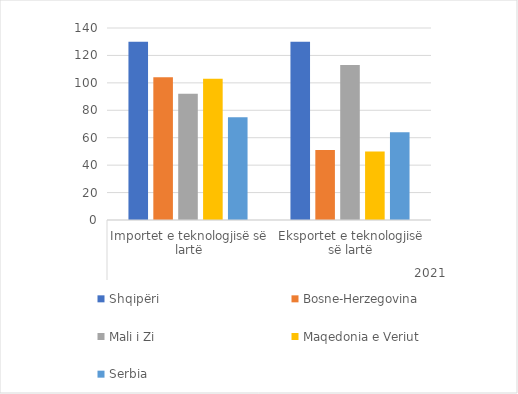
| Category | Shqipëri | Bosne-Herzegovina | Mali i Zi | Maqedonia e Veriut | Serbia |
|---|---|---|---|---|---|
| 0 | 130 | 104 | 92 | 103 | 75 |
| 1 | 130 | 51 | 113 | 50 | 64 |